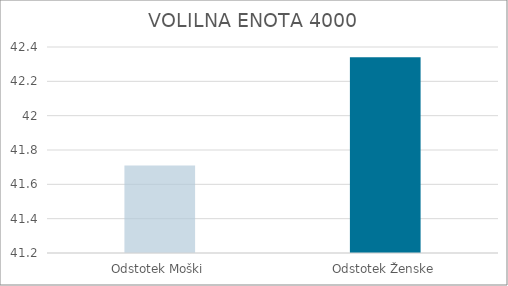
| Category | Series 0 |
|---|---|
| Odstotek Moški | 41.71 |
| Odstotek Ženske | 42.34 |